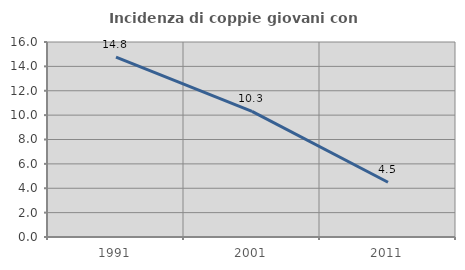
| Category | Incidenza di coppie giovani con figli |
|---|---|
| 1991.0 | 14.759 |
| 2001.0 | 10.303 |
| 2011.0 | 4.491 |